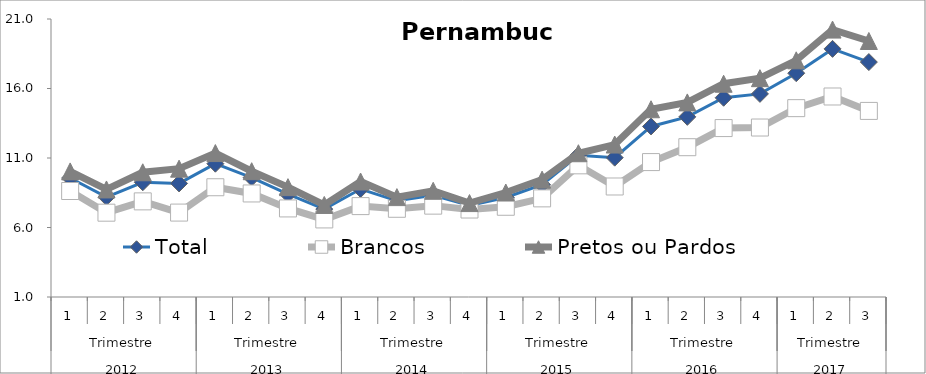
| Category | Total | Brancos | Pretos ou Pardos |
|---|---|---|---|
| 0 | 9.559 | 8.625 | 10.035 |
| 1 | 8.189 | 7.066 | 8.737 |
| 2 | 9.256 | 7.88 | 9.973 |
| 3 | 9.17 | 7.073 | 10.232 |
| 4 | 10.59 | 8.896 | 11.355 |
| 5 | 9.592 | 8.449 | 10.049 |
| 6 | 8.397 | 7.372 | 8.902 |
| 7 | 7.325 | 6.58 | 7.622 |
| 8 | 8.767 | 7.54 | 9.307 |
| 9 | 7.919 | 7.346 | 8.186 |
| 10 | 8.313 | 7.573 | 8.641 |
| 11 | 7.589 | 7.294 | 7.756 |
| 12 | 8.161 | 7.492 | 8.516 |
| 13 | 9.075 | 8.096 | 9.442 |
| 14 | 11.196 | 10.473 | 11.343 |
| 15 | 11.023 | 8.951 | 11.968 |
| 16 | 13.27 | 10.706 | 14.507 |
| 17 | 13.96 | 11.777 | 14.999 |
| 18 | 15.333 | 13.153 | 16.342 |
| 19 | 15.612 | 13.193 | 16.743 |
| 20 | 17.1 | 14.587 | 18.028 |
| 21 | 18.85 | 15.425 | 20.239 |
| 22 | 17.901 | 14.388 | 19.418 |